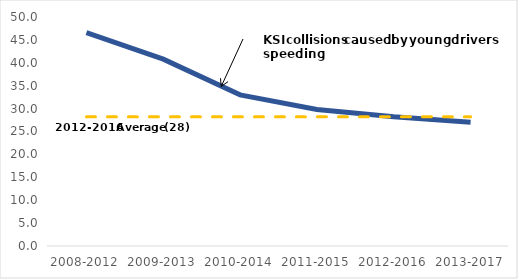
| Category | Series 0 | Series 1 |
|---|---|---|
| 2008-2012 | 46.6 | 28.2 |
| 2009-2013 | 40.8 | 28.2 |
| 2010-2014 | 33 | 28.2 |
| 2011-2015 | 29.8 | 28.2 |
| 2012-2016 | 28.2 | 28.2 |
| 2013-2017 | 27 | 28.2 |